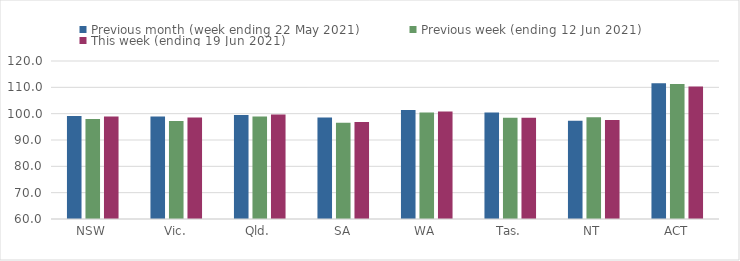
| Category | Previous month (week ending 22 May 2021) | Previous week (ending 12 Jun 2021) | This week (ending 19 Jun 2021) |
|---|---|---|---|
| NSW | 99.08 | 98.01 | 98.95 |
| Vic. | 98.92 | 97.21 | 98.53 |
| Qld. | 99.47 | 98.92 | 99.71 |
| SA | 98.52 | 96.51 | 96.82 |
| WA | 101.41 | 100.45 | 100.81 |
| Tas. | 100.43 | 98.44 | 98.44 |
| NT | 97.33 | 98.64 | 97.55 |
| ACT | 111.56 | 111.27 | 110.3 |